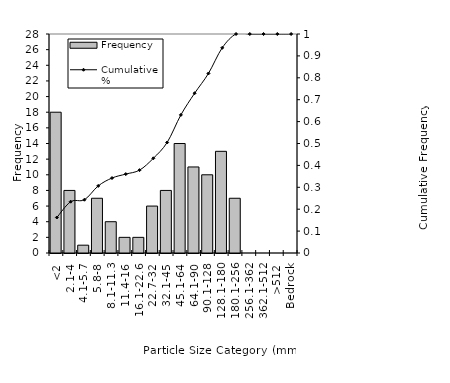
| Category | Frequency |
|---|---|
| <2 | 18 |
| 2.1-4 | 8 |
| 4.1-5.7 | 1 |
| 5.8-8 | 7 |
| 8.1-11.3 | 4 |
| 11.4-16 | 2 |
| 16.1-22.6 | 2 |
| 22.7-32 | 6 |
| 32.1-45 | 8 |
| 45.1-64 | 14 |
| 64.1-90 | 11 |
| 90.1-128 | 10 |
| 128.1-180 | 13 |
| 180.1-256 | 7 |
| 256.1-362 | 0 |
| 362.1-512 | 0 |
| >512 | 0 |
| Bedrock | 0 |